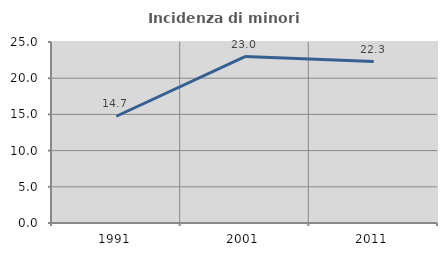
| Category | Incidenza di minori stranieri |
|---|---|
| 1991.0 | 14.744 |
| 2001.0 | 22.983 |
| 2011.0 | 22.303 |